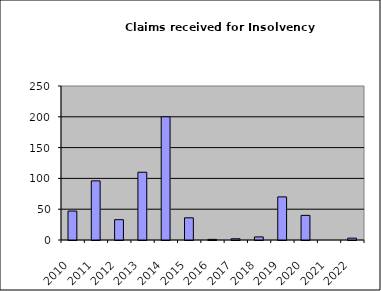
| Category | Series 1 |
|---|---|
| 2010.0 | 47 |
| 2011.0 | 96 |
| 2012.0 | 33 |
| 2013.0 | 110 |
| 2014.0 | 200 |
| 2015.0 | 36 |
| 2016.0 | 1 |
| 2017.0 | 2 |
| 2018.0 | 5 |
| 2019.0 | 70 |
| 2020.0 | 40 |
| 2021.0 | 0 |
| 2022.0 | 3 |